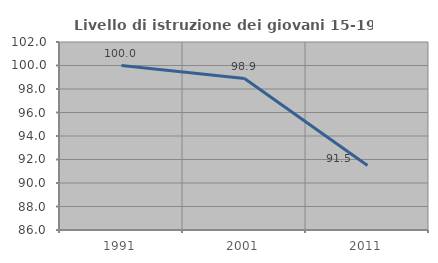
| Category | Livello di istruzione dei giovani 15-19 anni |
|---|---|
| 1991.0 | 100 |
| 2001.0 | 98.889 |
| 2011.0 | 91.489 |